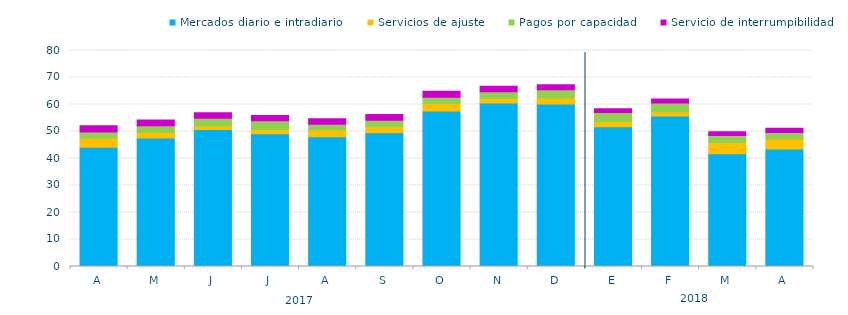
| Category | Mercados diario e intradiario  | Servicios de ajuste | Pagos por capacidad | Servicio de interrumpibilidad |
|---|---|---|---|---|
| A | 44.2 | 3.28 | 2.38 | 2.28 |
| M | 47.6 | 2.13 | 2.37 | 2.15 |
| J | 50.77 | 1.25 | 2.91 | 2 |
| J | 49.13 | 1.65 | 3.22 | 1.93 |
| A | 48.03 | 2.5 | 2.18 | 1.99 |
| S | 49.52 | 2.2 | 2.41 | 2.14 |
| O | 57.59 | 2.78 | 2.34 | 2.16 |
| N | 60.56 | 1.68 | 2.49 | 2.07 |
| D | 60.14 | 2.25 | 3.07 | 1.85 |
| E | 51.77 | 1.95 | 3.3 | 1.38 |
| F | 55.76 | 1.57 | 3.25 | 1.46 |
| M | 41.75 | 4.21 | 2.56 | 1.41 |
| A | 43.51 | 3.68 | 2.43 | 1.56 |